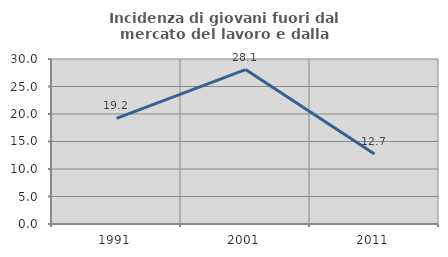
| Category | Incidenza di giovani fuori dal mercato del lavoro e dalla formazione  |
|---|---|
| 1991.0 | 19.209 |
| 2001.0 | 28.082 |
| 2011.0 | 12.727 |